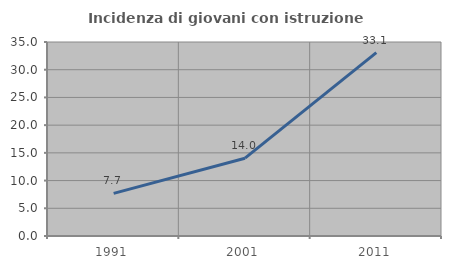
| Category | Incidenza di giovani con istruzione universitaria |
|---|---|
| 1991.0 | 7.692 |
| 2001.0 | 14.04 |
| 2011.0 | 33.077 |